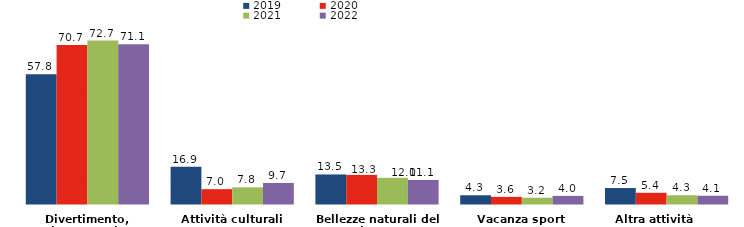
| Category | 2019 | 2020 | 2021 | 2022 |
|---|---|---|---|---|
| Divertimento, riposo o relax | 57.8 | 70.7 | 72.7 | 71.092 |
| Attività culturali | 16.9 | 7 | 7.8 | 9.731 |
| Bellezze naturali del luogo | 13.5 | 13.3 | 12 | 11.073 |
| Vacanza sport | 4.3 | 3.6 | 3.2 | 4.024 |
| Altra attività       | 7.5 | 5.4 | 4.3 | 4.083 |